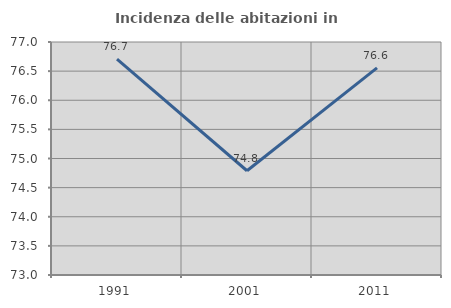
| Category | Incidenza delle abitazioni in proprietà  |
|---|---|
| 1991.0 | 76.707 |
| 2001.0 | 74.79 |
| 2011.0 | 76.555 |